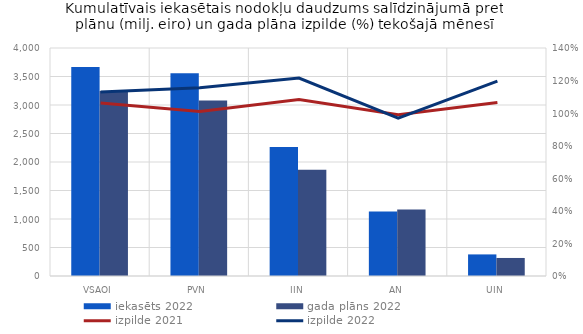
| Category | iekasēts 2022 | gada plāns 2022 |
|---|---|---|
| VSAOI | 3667.216 | 3246.094 |
| PVN | 3558.671 | 3076.973 |
| IIN | 2262.477 | 1861.97 |
| AN | 1131.033 | 1166.8 |
| UIN | 378.75 | 316.4 |